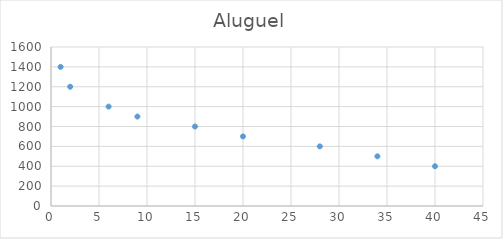
| Category | Aluguel |
|---|---|
| 40.0 | 400 |
| 34.0 | 500 |
| 28.0 | 600 |
| 20.0 | 700 |
| 15.0 | 800 |
| 9.0 | 900 |
| 6.0 | 1000 |
| 2.0 | 1200 |
| 1.0 | 1400 |